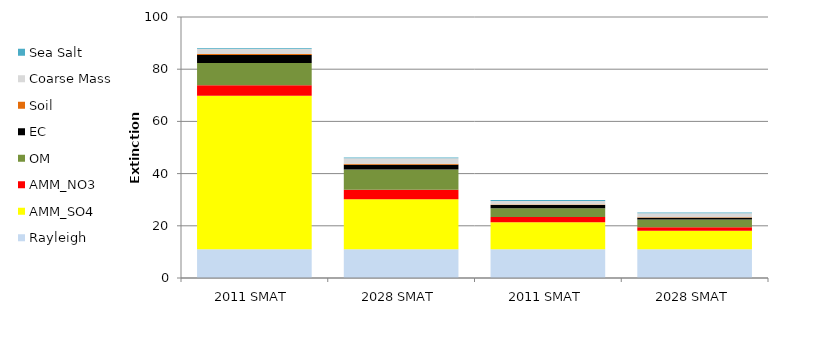
| Category | Rayleigh | AMM_SO4 | AMM_NO3 | OM | EC | Soil | Coarse Mass | Sea Salt |
|---|---|---|---|---|---|---|---|---|
| 0 | 11 | 58.787 | 4.069 | 8.479 | 3.12 | 0.41 | 1.939 | 0.325 |
| 1 | 11 | 19.13 | 3.665 | 7.784 | 1.809 | 0.347 | 2.114 | 0.325 |
| 2 | 11 | 10.346 | 2.07 | 3.303 | 1.246 | 0.174 | 1.405 | 0.32 |
| 3 | 11 | 7.134 | 1.317 | 3 | 0.675 | 0.145 | 1.533 | 0.32 |